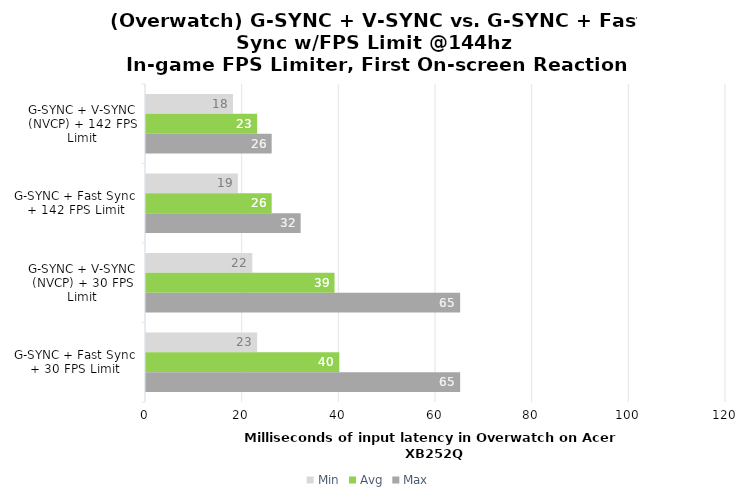
| Category | Min | Avg | Max |
|---|---|---|---|
| G-SYNC + V-SYNC (NVCP) + 142 FPS Limit | 18 | 23 | 26 |
| G-SYNC + Fast Sync + 142 FPS Limit | 19 | 26 | 32 |
| G-SYNC + V-SYNC (NVCP) + 30 FPS Limit | 22 | 39 | 65 |
| G-SYNC + Fast Sync + 30 FPS Limit | 23 | 40 | 65 |